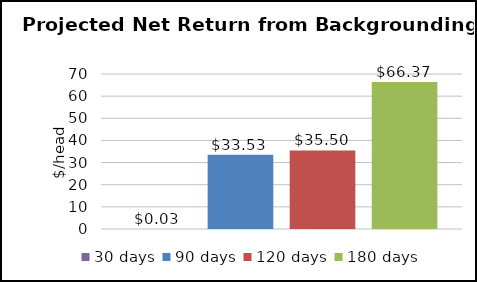
| Category | 30 days | 90 days | 120 days | 180 days |
|---|---|---|---|---|
| Net Return from Backgrounding($/head) | 0.033 | 33.533 | 35.497 | 66.367 |